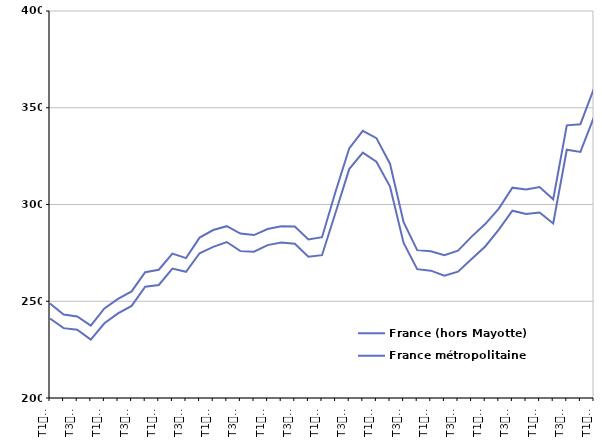
| Category | France (hors Mayotte) | France métropolitaine |
|---|---|---|
| T1
2011 | 248.8 | 241.1 |
| T2
2011 | 243.1 | 236.1 |
| T3
2011 | 242.1 | 235.3 |
| T4
2011 | 237.4 | 230.2 |
| T1
2012 | 246.3 | 238.6 |
| T2
2012 | 251.2 | 243.7 |
| T3
2012 | 255.1 | 247.6 |
| T4
2012 | 265 | 257.5 |
| T1
2013 | 266.3 | 258.4 |
| T2
2013 | 274.6 | 266.9 |
| T3
2013 | 272.3 | 265.2 |
| T4
2013 | 282.9 | 274.8 |
| T1
2014 | 286.8 | 278.1 |
| T2
2014 | 288.8 | 280.6 |
| T3
2014 | 285 | 275.9 |
| T4
2014 | 284.2 | 275.6 |
| T1
2015 | 287.3 | 279 |
| T2
2015 | 288.7 | 280.3 |
| T3
2015 | 288.6 | 279.7 |
| T4
2015 | 281.9 | 273 |
| T1
2016 | 283.1 | 273.8 |
| T2
2016 | 306.7 | 295.9 |
| T3
2016 | 329 | 318.3 |
| T4
2016 | 338.1 | 326.8 |
| T1
2017 | 334.3 | 322.1 |
| T2
2017 | 321.1 | 309.3 |
| T3
2017 | 290.9 | 280.1 |
| T4
2017 | 276.4 | 266.6 |
| T1
2018 | 275.8 | 265.8 |
| T2
2018 | 273.8 | 263.2 |
| T3
2018 | 276.1 | 265.3 |
| T4
2018 | 283.4 | 271.8 |
| T1
2019 | 289.9 | 278.3 |
| T2
2019 | 297.9 | 287 |
| T3
2019 | 308.7 | 296.8 |
| T4
2019 | 307.8 | 295.1 |
| T1
2020 | 309 | 295.9 |
| T2
2020 | 302.7 | 290.2 |
| T3
2020 | 340.9 | 328.3 |
| T4
2020 | 341.5 | 327.2 |
| T1
2021 | 360 | 345.2 |